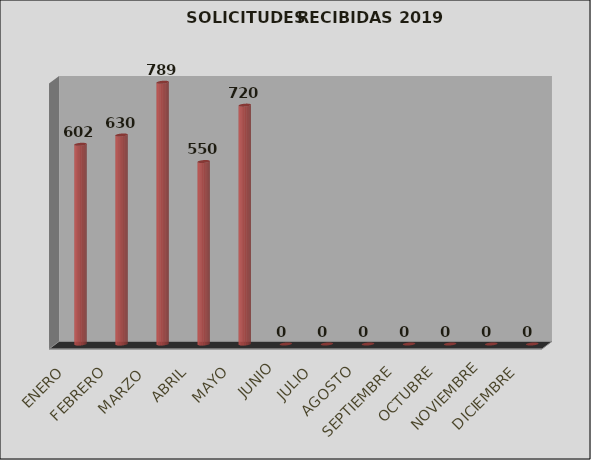
| Category | Series 0 | Series 1 |
|---|---|---|
| ENERO |  | 602 |
| FEBRERO |  | 630 |
| MARZO  |  | 789 |
| ABRIL |  | 550 |
| MAYO |  | 720 |
| JUNIO |  | 0 |
| JULIO |  | 0 |
| AGOSTO |  | 0 |
| SEPTIEMBRE |  | 0 |
| OCTUBRE |  | 0 |
| NOVIEMBRE |  | 0 |
| DICIEMBRE |  | 0 |